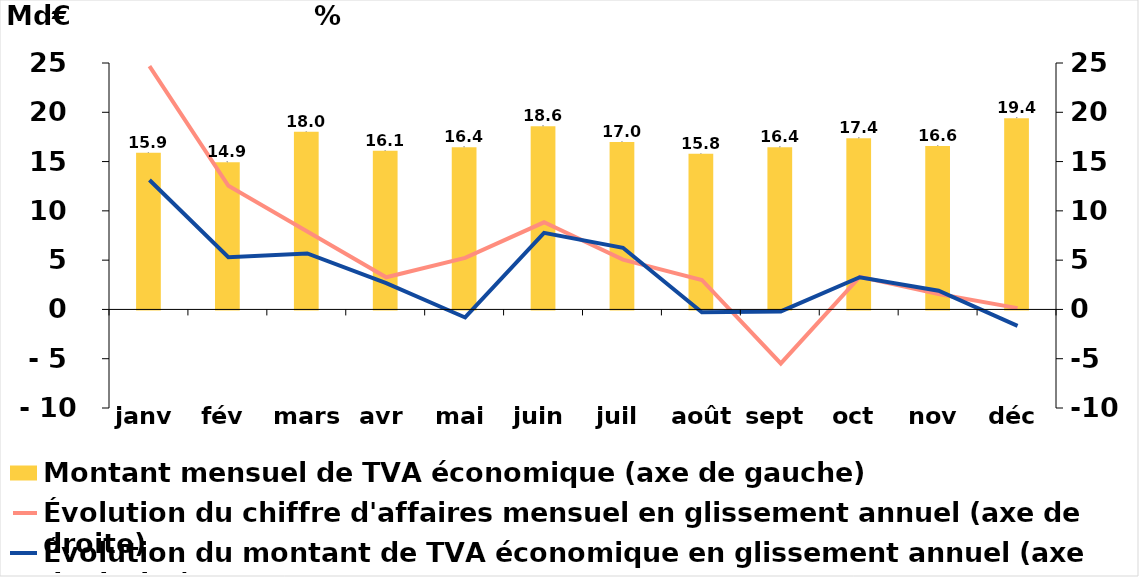
| Category | Montant mensuel de TVA économique (axe de gauche) |
|---|---|
| janv | 15.894 |
| fév | 14.929 |
| mars | 18.026 |
| avr | 16.086 |
| mai | 16.446 |
| juin | 18.575 |
| juil | 16.994 |
| août | 15.794 |
| sept | 16.441 |
| oct | 17.361 |
| nov | 16.588 |
| déc | 19.406 |